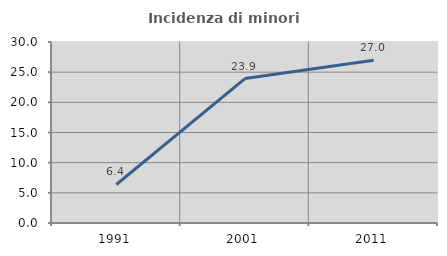
| Category | Incidenza di minori stranieri |
|---|---|
| 1991.0 | 6.383 |
| 2001.0 | 23.94 |
| 2011.0 | 26.978 |